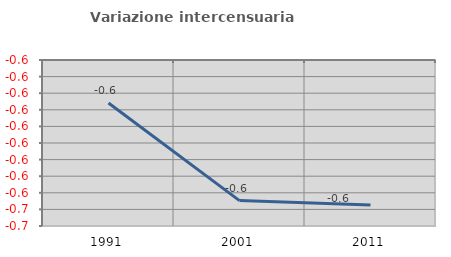
| Category | Variazione intercensuaria annua |
|---|---|
| 1991.0 | -0.586 |
| 2001.0 | -0.645 |
| 2011.0 | -0.647 |